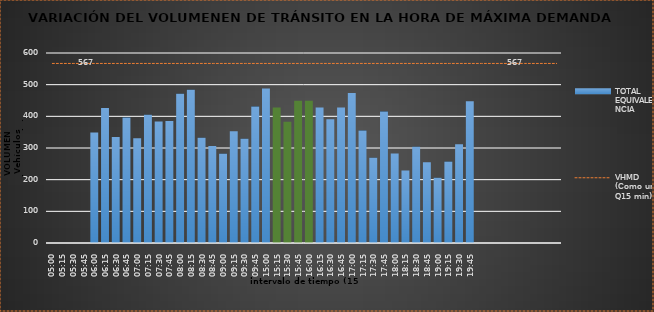
| Category | TOTAL EQUIVALENCIA   |
|---|---|
| 500.0 | 0 |
| 515.0 | 0 |
| 530.0 | 0 |
| 545.0 | 0 |
| 600.0 | 349 |
| 615.0 | 426 |
| 630.0 | 335 |
| 645.0 | 396 |
| 700.0 | 331 |
| 715.0 | 405 |
| 730.0 | 384 |
| 745.0 | 385 |
| 800.0 | 471 |
| 815.0 | 484 |
| 830.0 | 332 |
| 845.0 | 306 |
| 900.0 | 282 |
| 915.0 | 353 |
| 930.0 | 329 |
| 945.0 | 431 |
| 1500.0 | 488 |
| 1515.0 | 428 |
| 1530.0 | 383 |
| 1545.0 | 449 |
| 1600.0 | 449 |
| 1615.0 | 428 |
| 1630.0 | 391 |
| 1645.0 | 428 |
| 1700.0 | 474 |
| 1715.0 | 355 |
| 1730.0 | 269 |
| 1745.0 | 415 |
| 1800.0 | 283 |
| 1815.0 | 229 |
| 1830.0 | 304 |
| 1845.0 | 255 |
| 1900.0 | 206 |
| 1915.0 | 257 |
| 1930.0 | 312 |
| 1945.0 | 448 |